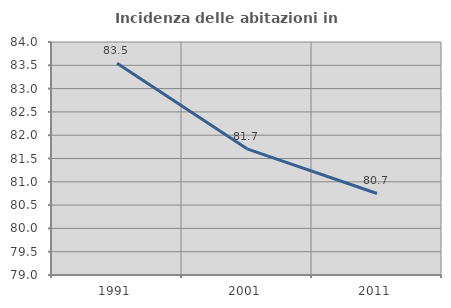
| Category | Incidenza delle abitazioni in proprietà  |
|---|---|
| 1991.0 | 83.544 |
| 2001.0 | 81.707 |
| 2011.0 | 80.75 |